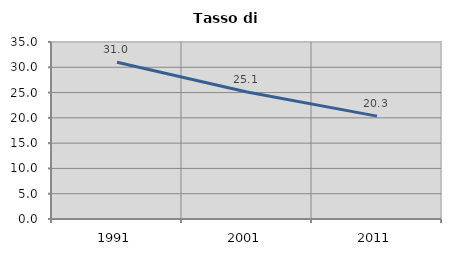
| Category | Tasso di disoccupazione   |
|---|---|
| 1991.0 | 31.009 |
| 2001.0 | 25.102 |
| 2011.0 | 20.344 |